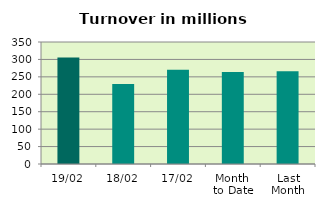
| Category | Series 0 |
|---|---|
| 19/02 | 305.847 |
| 18/02 | 229.184 |
| 17/02 | 270.623 |
| Month 
to Date | 263.725 |
| Last
Month | 265.89 |